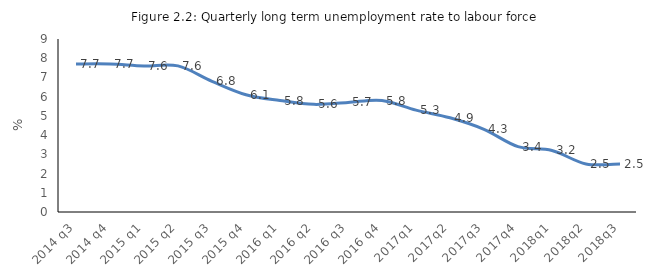
| Category | Series 0 |
|---|---|
| 2014 q3 | 7.7 |
| 2014 q4 | 7.7 |
| 2015 q1 | 7.6 |
| 2015 q2 | 7.6 |
| 2015 q3 | 6.8 |
| 2015 q4 | 6.1 |
| 2016 q1 | 5.8 |
| 2016 q2 | 5.6 |
| 2016 q3 | 5.7 |
| 2016 q4 | 5.8 |
| 2017q1 | 5.3 |
| 2017q2 | 4.9 |
| 2017q3 | 4.3 |
| 2017q4 | 3.4 |
| 2018q1 | 3.2 |
| 2018q2 | 2.5 |
| 2018q3 | 2.5 |